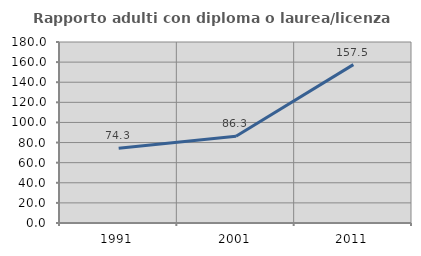
| Category | Rapporto adulti con diploma o laurea/licenza media  |
|---|---|
| 1991.0 | 74.286 |
| 2001.0 | 86.275 |
| 2011.0 | 157.5 |